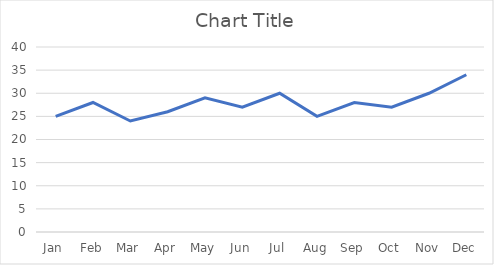
| Category | Series 0 |
|---|---|
| Jan | 25 |
| Feb | 28 |
| Mar | 24 |
| Apr | 26 |
| May | 29 |
| Jun | 27 |
| Jul | 30 |
| Aug | 25 |
| Sep | 28 |
| Oct | 27 |
| Nov | 30 |
| Dec | 34 |